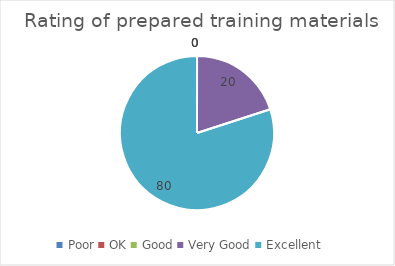
| Category | Rating of prepared training materials (%) |
|---|---|
| Poor | 0 |
| OK | 0 |
| Good | 0 |
| Very Good | 20 |
| Excellent | 80 |